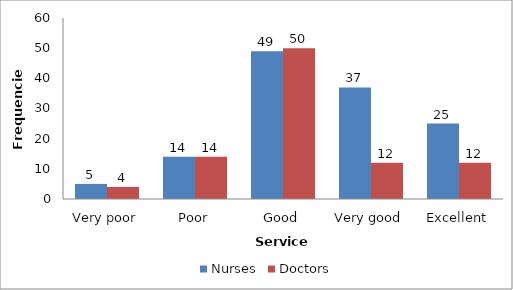
| Category | Nurses | Doctors |
|---|---|---|
| Very poor | 5 | 4 |
| Poor | 14 | 14 |
| Good | 49 | 50 |
| Very good | 37 | 12 |
| Excellent | 25 | 12 |